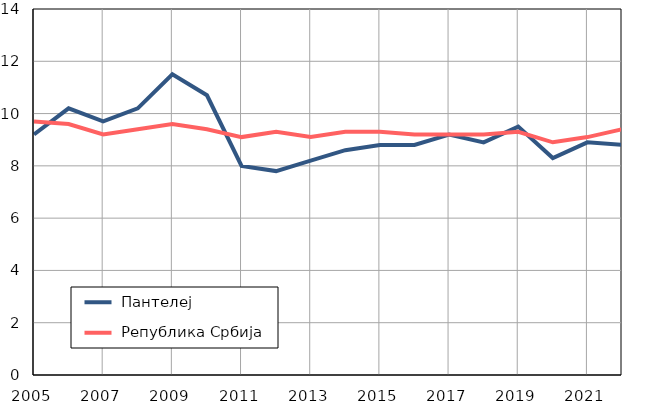
| Category |  Пантелеј |  Република Србија |
|---|---|---|
| 2005.0 | 9.2 | 9.7 |
| 2006.0 | 10.2 | 9.6 |
| 2007.0 | 9.7 | 9.2 |
| 2008.0 | 10.2 | 9.4 |
| 2009.0 | 11.5 | 9.6 |
| 2010.0 | 10.7 | 9.4 |
| 2011.0 | 8 | 9.1 |
| 2012.0 | 7.8 | 9.3 |
| 2013.0 | 8.2 | 9.1 |
| 2014.0 | 8.6 | 9.3 |
| 2015.0 | 8.8 | 9.3 |
| 2016.0 | 8.8 | 9.2 |
| 2017.0 | 9.2 | 9.2 |
| 2018.0 | 8.9 | 9.2 |
| 2019.0 | 9.5 | 9.3 |
| 2020.0 | 8.3 | 8.9 |
| 2021.0 | 8.9 | 9.1 |
| 2022.0 | 8.8 | 9.4 |